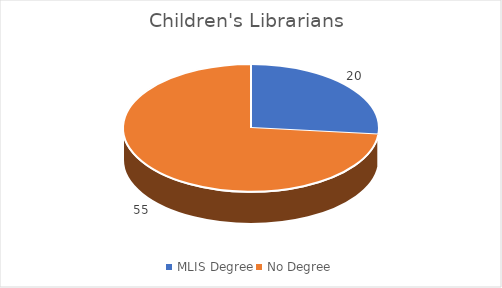
| Category | Series 0 |
|---|---|
| MLIS Degree | 20 |
| No Degree | 55 |